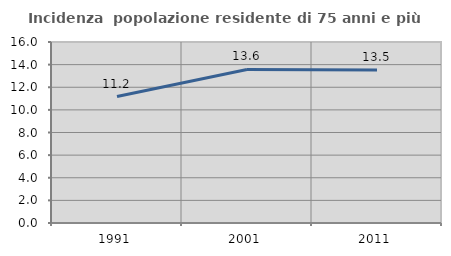
| Category | Incidenza  popolazione residente di 75 anni e più |
|---|---|
| 1991.0 | 11.18 |
| 2001.0 | 13.569 |
| 2011.0 | 13.529 |